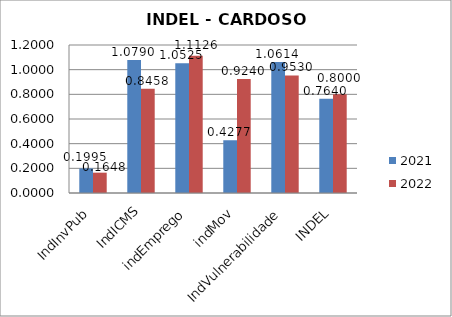
| Category | 2021 | 2022 |
|---|---|---|
| IndInvPub | 0.2 | 0.165 |
| IndICMS | 1.079 | 0.846 |
| indEmprego | 1.052 | 1.113 |
| indMov | 0.428 | 0.924 |
| IndVulnerabilidade | 1.061 | 0.953 |
| INDEL | 0.764 | 0.8 |